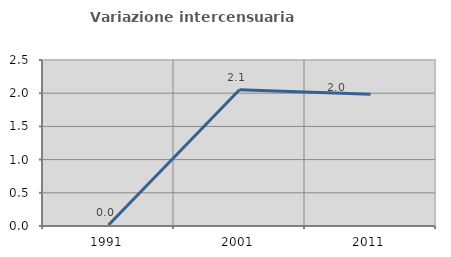
| Category | Variazione intercensuaria annua |
|---|---|
| 1991.0 | 0.015 |
| 2001.0 | 2.051 |
| 2011.0 | 1.983 |